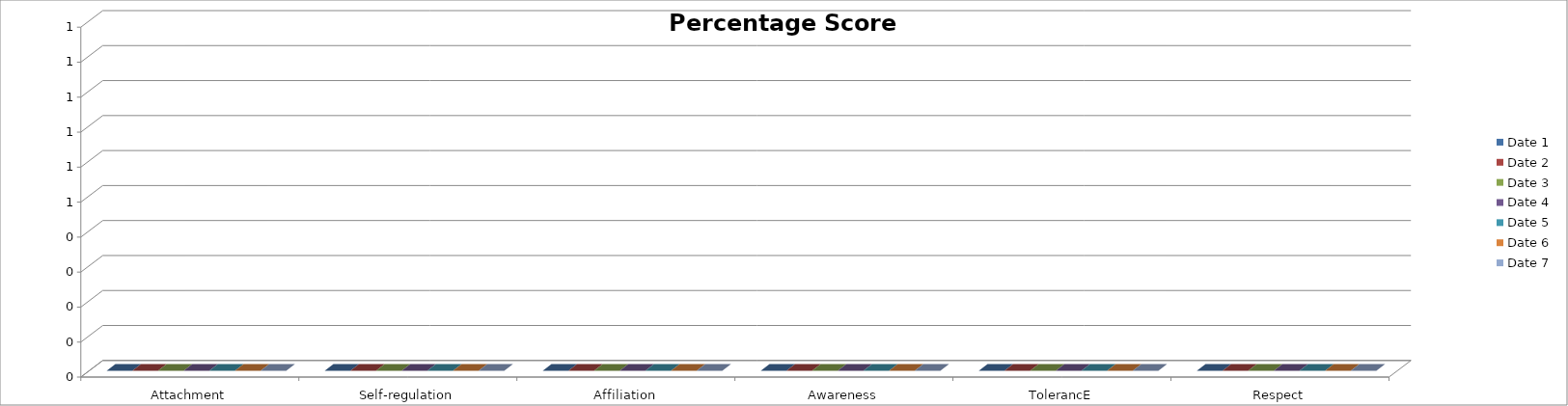
| Category | Date 1 | Date 2 | Date 3 | Date 4 | Date 5 | Date 6 | Date 7 |
|---|---|---|---|---|---|---|---|
| Attachment | 0 | 0 | 0 | 0 | 0 | 0 | 0 |
| Self-regulation | 0 | 0 | 0 | 0 | 0 | 0 | 0 |
| Affiliation | 0 | 0 | 0 | 0 | 0 | 0 | 0 |
| Awareness | 0 | 0 | 0 | 0 | 0 | 0 | 0 |
| TolerancE | 0 | 0 | 0 | 0 | 0 | 0 | 0 |
| Respect | 0 | 0 | 0 | 0 | 0 | 0 | 0 |